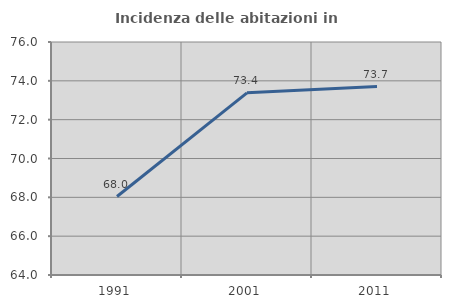
| Category | Incidenza delle abitazioni in proprietà  |
|---|---|
| 1991.0 | 68.041 |
| 2001.0 | 73.38 |
| 2011.0 | 73.703 |